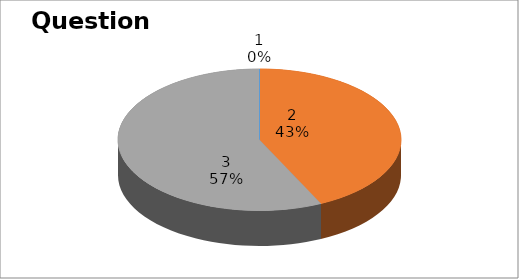
| Category | Series 0 |
|---|---|
| 0 | 0 |
| 1 | 12 |
| 2 | 16 |